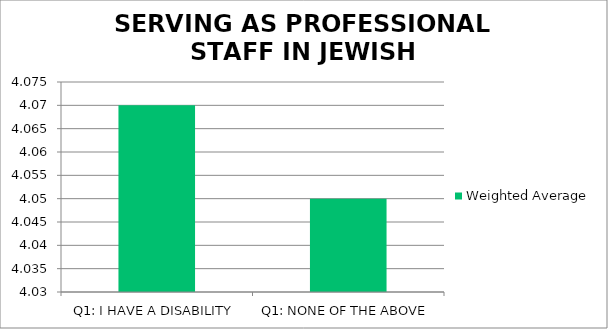
| Category | Weighted Average |
|---|---|
| Q1: I HAVE A DISABILITY | 4.07 |
| Q1: NONE OF THE ABOVE | 4.05 |